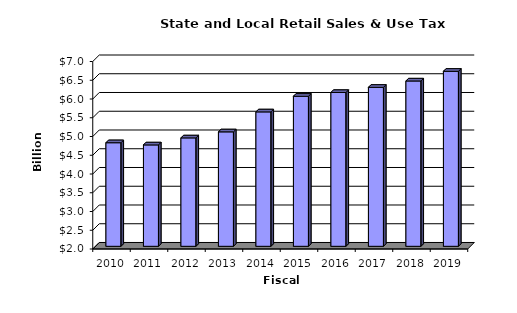
| Category | Series 0 |
|---|---|
| 2010.0 | 4.762 |
| 2011.0 | 4.704 |
| 2012.0 | 4.891 |
| 2013.0 | 5.052 |
| 2014.0 | 5.585 |
| 2015.0 | 6.001 |
| 2016.0 | 6.102 |
| 2017.0 | 6.24 |
| 2018.0 | 6.409 |
| 2019.0 | 6.667 |